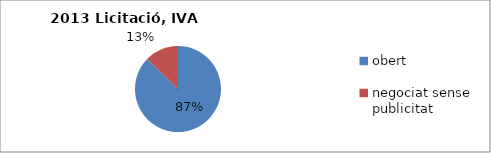
| Category | Licitació, IVA exclòs |
|---|---|
| obert | 4064796.8 |
| negociat sense publicitat  | 594160.12 |